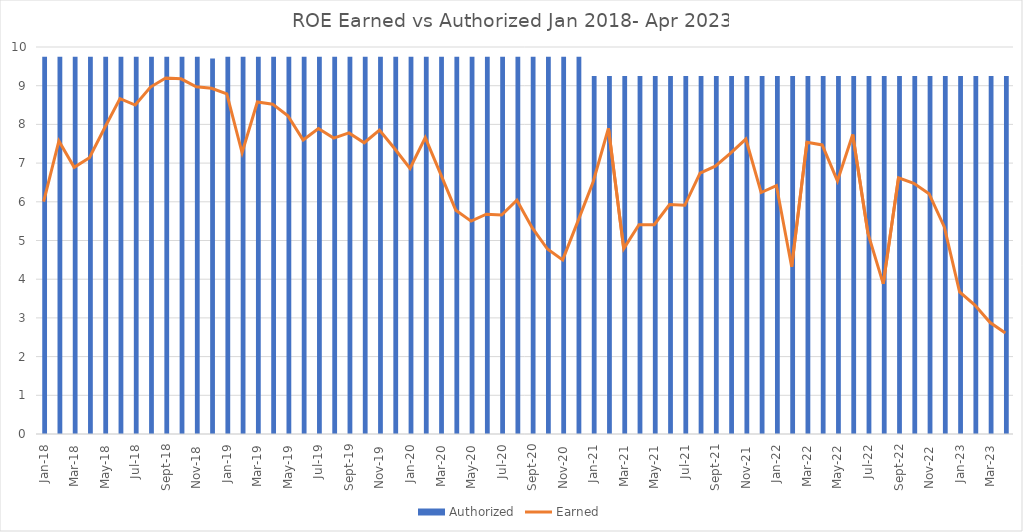
| Category | Authorized |
|---|---|
| Jan-18 | 9.75 |
| Feb-18 | 9.75 |
| Mar-18 | 9.75 |
| Apr-18 | 9.75 |
| May-18 | 9.75 |
| Jun-18 | 9.75 |
| Jul-18 | 9.75 |
| Aug-18 | 9.75 |
| Sep-18 | 9.75 |
| Oct-18 | 9.75 |
| Nov-18 | 9.75 |
| Dec-18 | 9.7 |
| Jan-19 | 9.75 |
| Feb-19 | 9.75 |
| Mar-19 | 9.75 |
| Apr-19 | 9.75 |
| May-19 | 9.75 |
| Jun-19 | 9.75 |
| Jul-19 | 9.75 |
| Aug-19 | 9.75 |
| Sep-19 | 9.75 |
| Oct-19 | 9.75 |
| Nov-19 | 9.75 |
| Dec-19 | 9.75 |
| Jan-20 | 9.75 |
| Feb-20 | 9.75 |
| Mar-20 | 9.75 |
| Apr-20 | 9.75 |
| May-20 | 9.75 |
| Jun-20 | 9.75 |
| Jul-20 | 9.75 |
| Aug-20 | 9.75 |
| Sep-20 | 9.75 |
| Oct-20 | 9.75 |
| Nov-20 | 9.75 |
| Dec-20 | 9.75 |
| Jan-21 | 9.25 |
| Feb-21 | 9.25 |
| Mar-21 | 9.25 |
| Apr-21 | 9.25 |
| May-21 | 9.25 |
| Jun-21 | 9.25 |
| Jul-21 | 9.25 |
| Aug-21 | 9.25 |
| Sep-21 | 9.25 |
| Oct-21 | 9.25 |
| Nov-21 | 9.25 |
| Dec-21 | 9.25 |
| Jan-22 | 9.25 |
| Feb-22 | 9.25 |
| Mar-22 | 9.25 |
| Apr-22 | 9.25 |
| May-22 | 9.25 |
| Jun-22 | 9.25 |
| Jul-22 | 9.25 |
| Aug-22 | 9.25 |
| Sep-22 | 9.25 |
| Oct-22 | 9.25 |
| Nov-22 | 9.25 |
| Dec-22 | 9.25 |
| Jan-23 | 9.25 |
| Feb-23 | 9.25 |
| Mar-23 | 9.25 |
| Apr-23 | 9.25 |